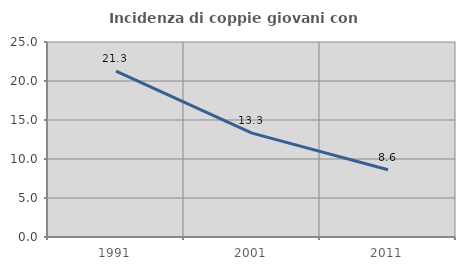
| Category | Incidenza di coppie giovani con figli |
|---|---|
| 1991.0 | 21.268 |
| 2001.0 | 13.319 |
| 2011.0 | 8.628 |